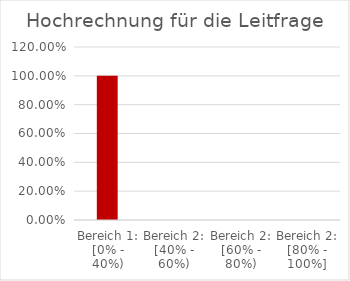
| Category | Series 0 |
|---|---|
| Bereich 1: [0% - 40%) | 1 |
| Bereich 2: [40% - 60%) | 0 |
| Bereich 2: [60% - 80%) | 0 |
| Bereich 2: [80% - 100%] | 0 |